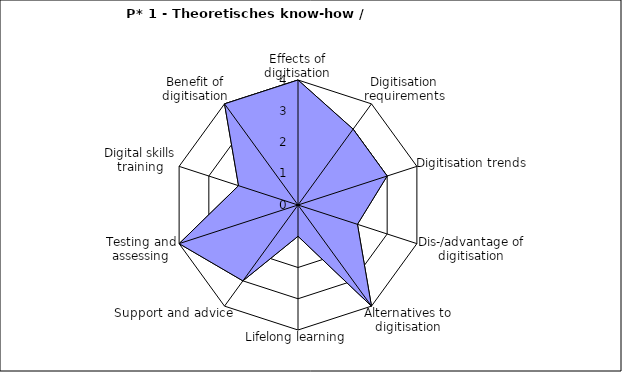
| Category | Series 1 | Series 0 |
|---|---|---|
| Effects of digitisation | 4 | 4 |
| Digitisation requirements | 3 | 3 |
| Digitisation trends | 3 | 3 |
| Dis-/advantage of digitisation | 2 | 2 |
| Alternatives to digitisation | 4 | 4 |
| Lifelong learning | 1 | 1 |
| Support and advice | 3 | 3 |
| Testing and assessing | 4 | 4 |
| Digital skills training | 2 | 2 |
| Benefit of digitisation | 4 | 4 |